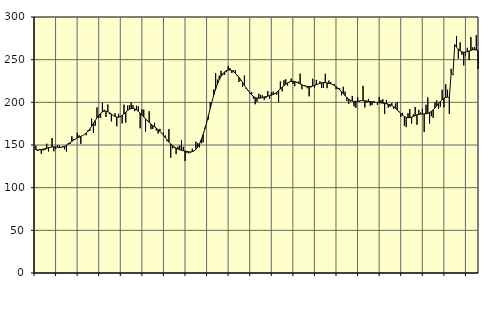
| Category | Piggar | Series 1 |
|---|---|---|
| nan | 149.1 | 144.2 |
| 1.0 | 143.1 | 144.2 |
| 1.0 | 145.3 | 144.4 |
| 1.0 | 139.7 | 144.72 |
| 1.0 | 143.7 | 145.1 |
| 1.0 | 144.1 | 145.56 |
| 1.0 | 151.5 | 146.1 |
| 1.0 | 142.4 | 146.74 |
| 1.0 | 147 | 147.3 |
| 1.0 | 158.2 | 147.66 |
| 1.0 | 142.6 | 147.77 |
| 1.0 | 145.2 | 147.68 |
| nan | 149.8 | 147.46 |
| 2.0 | 149.3 | 147.24 |
| 2.0 | 147 | 147.25 |
| 2.0 | 148.5 | 147.62 |
| 2.0 | 144.9 | 148.42 |
| 2.0 | 142.3 | 149.6 |
| 2.0 | 152.1 | 151.05 |
| 2.0 | 151.3 | 152.65 |
| 2.0 | 160.4 | 154.23 |
| 2.0 | 157.1 | 155.7 |
| 2.0 | 156.8 | 157.04 |
| 2.0 | 164.3 | 158.21 |
| nan | 161.3 | 159.2 |
| 3.0 | 151.4 | 160.14 |
| 3.0 | 161.2 | 161.12 |
| 3.0 | 162.5 | 162.33 |
| 3.0 | 161.4 | 163.97 |
| 3.0 | 167.3 | 166.14 |
| 3.0 | 166.6 | 168.78 |
| 3.0 | 180.9 | 171.86 |
| 3.0 | 164.3 | 175.22 |
| 3.0 | 172.4 | 178.63 |
| 3.0 | 194.1 | 181.92 |
| 3.0 | 181.7 | 184.84 |
| nan | 182 | 187.16 |
| 4.0 | 199.6 | 188.81 |
| 4.0 | 191.2 | 189.66 |
| 4.0 | 182.8 | 189.71 |
| 4.0 | 197.4 | 189.04 |
| 4.0 | 186 | 187.8 |
| 4.0 | 177.7 | 186.24 |
| 4.0 | 184.7 | 184.66 |
| 4.0 | 187.1 | 183.38 |
| 4.0 | 171.9 | 182.69 |
| 4.0 | 186.6 | 182.64 |
| 4.0 | 182.8 | 183.33 |
| nan | 175.4 | 184.71 |
| 5.0 | 197.3 | 186.5 |
| 5.0 | 176.3 | 188.46 |
| 5.0 | 196.1 | 190.36 |
| 5.0 | 196.6 | 191.83 |
| 5.0 | 199.8 | 192.67 |
| 5.0 | 196.7 | 192.83 |
| 5.0 | 189.7 | 192.31 |
| 5.0 | 196 | 191.13 |
| 5.0 | 195.3 | 189.45 |
| 5.0 | 169.6 | 187.43 |
| 5.0 | 191.7 | 185.19 |
| nan | 191.4 | 182.88 |
| 6.0 | 165.7 | 180.61 |
| 6.0 | 179.1 | 178.46 |
| 6.0 | 189.6 | 176.44 |
| 6.0 | 168.5 | 174.57 |
| 6.0 | 168.8 | 172.86 |
| 6.0 | 176.1 | 171.27 |
| 6.0 | 167 | 169.69 |
| 6.0 | 163.4 | 168.01 |
| 6.0 | 168.9 | 166.08 |
| 6.0 | 164.3 | 163.85 |
| 6.0 | 164.4 | 161.34 |
| nan | 161.1 | 158.66 |
| 7.0 | 154.4 | 156.01 |
| 7.0 | 168.7 | 153.55 |
| 7.0 | 135.1 | 151.31 |
| 7.0 | 146.2 | 149.32 |
| 7.0 | 146.3 | 147.69 |
| 7.0 | 139.2 | 146.37 |
| 7.0 | 148 | 145.29 |
| 7.0 | 149.6 | 144.45 |
| 7.0 | 155.5 | 143.79 |
| 7.0 | 147.9 | 143.27 |
| 7.0 | 131.3 | 142.8 |
| nan | 140.8 | 142.36 |
| 8.0 | 140 | 142.01 |
| 8.0 | 140.7 | 141.87 |
| 8.0 | 145.7 | 142.13 |
| 8.0 | 143.3 | 143.07 |
| 8.0 | 153.9 | 144.85 |
| 8.0 | 152.2 | 147.62 |
| 8.0 | 147.1 | 151.45 |
| 8.0 | 152 | 156.29 |
| 8.0 | 153 | 162.12 |
| 8.0 | 170.4 | 168.87 |
| 8.0 | 177.2 | 176.46 |
| nan | 180 | 184.62 |
| 9.0 | 200.1 | 192.95 |
| 9.0 | 201.1 | 201.11 |
| 9.0 | 215.2 | 208.76 |
| 9.0 | 234.3 | 215.61 |
| 9.0 | 226.7 | 221.53 |
| 9.0 | 231.3 | 226.45 |
| 9.0 | 237 | 230.43 |
| 9.0 | 232.1 | 233.56 |
| 9.0 | 232.2 | 235.83 |
| 9.0 | 235.4 | 237.27 |
| 9.0 | 242.5 | 237.91 |
| nan | 240.1 | 237.85 |
| 10.0 | 234.4 | 237.13 |
| 10.0 | 237.6 | 235.79 |
| 10.0 | 237.8 | 233.98 |
| 10.0 | 230.8 | 231.78 |
| 10.0 | 223.9 | 229.23 |
| 10.0 | 225.6 | 226.34 |
| 10.0 | 218.2 | 223.2 |
| 10.0 | 231.4 | 219.97 |
| 10.0 | 215.6 | 216.82 |
| 10.0 | 213.3 | 213.85 |
| 10.0 | 210.1 | 211.18 |
| nan | 212.2 | 208.89 |
| 11.0 | 204.3 | 207.07 |
| 11.0 | 197.7 | 205.77 |
| 11.0 | 200.7 | 205 |
| 11.0 | 210 | 204.81 |
| 11.0 | 208.8 | 205.05 |
| 11.0 | 208.2 | 205.61 |
| 11.0 | 203 | 206.25 |
| 11.0 | 205 | 206.84 |
| 11.0 | 213.2 | 207.33 |
| 11.0 | 204 | 207.82 |
| 11.0 | 211.6 | 208.41 |
| nan | 212.5 | 209.21 |
| 12.0 | 210.7 | 210.33 |
| 12.0 | 209 | 211.86 |
| 12.0 | 200.3 | 213.72 |
| 12.0 | 224.5 | 215.71 |
| 12.0 | 212.9 | 217.68 |
| 12.0 | 225.9 | 219.56 |
| 12.0 | 227 | 221.26 |
| 12.0 | 219.6 | 222.69 |
| 12.0 | 224.2 | 223.78 |
| 12.0 | 227.9 | 224.45 |
| 12.0 | 221.8 | 224.62 |
| nan | 218.9 | 224.3 |
| 13.0 | 222.8 | 223.58 |
| 13.0 | 224.3 | 222.6 |
| 13.0 | 233.6 | 221.53 |
| 13.0 | 215.4 | 220.52 |
| 13.0 | 219.5 | 219.66 |
| 13.0 | 219.9 | 219 |
| 13.0 | 216.5 | 218.58 |
| 13.0 | 207.1 | 218.45 |
| 13.0 | 217.5 | 218.63 |
| 13.0 | 227.6 | 219.09 |
| 13.0 | 217 | 219.76 |
| nan | 226.3 | 220.6 |
| 14.0 | 221.5 | 221.5 |
| 14.0 | 224.6 | 222.27 |
| 14.0 | 216.8 | 222.83 |
| 14.0 | 216.9 | 223.08 |
| 14.0 | 233.6 | 223.06 |
| 14.0 | 216.6 | 222.78 |
| 14.0 | 225.5 | 222.34 |
| 14.0 | 223.7 | 221.76 |
| 14.0 | 220.7 | 220.96 |
| 14.0 | 221.5 | 219.86 |
| 14.0 | 215.5 | 218.45 |
| nan | 215.5 | 216.74 |
| 15.0 | 216.4 | 214.73 |
| 15.0 | 208.2 | 212.52 |
| 15.0 | 218.2 | 210.14 |
| 15.0 | 212.5 | 207.8 |
| 15.0 | 201.7 | 205.65 |
| 15.0 | 198.2 | 203.79 |
| 15.0 | 201 | 202.4 |
| 15.0 | 207.5 | 201.51 |
| 15.0 | 195.3 | 201.09 |
| 15.0 | 193.4 | 201.06 |
| 15.0 | 206.2 | 201.29 |
| nan | 200.3 | 201.63 |
| 16.0 | 201.9 | 201.89 |
| 16.0 | 219.3 | 201.95 |
| 16.0 | 194 | 201.84 |
| 16.0 | 199.4 | 201.55 |
| 16.0 | 204 | 201.17 |
| 16.0 | 196.1 | 200.83 |
| 16.0 | 196.8 | 200.51 |
| 16.0 | 201.5 | 200.23 |
| 16.0 | 200.1 | 200 |
| 16.0 | 196.9 | 199.8 |
| 16.0 | 206.2 | 199.6 |
| nan | 202.6 | 199.36 |
| 17.0 | 203.7 | 199.06 |
| 17.0 | 186.3 | 198.71 |
| 17.0 | 202.7 | 198.33 |
| 17.0 | 193.7 | 197.88 |
| 17.0 | 194.9 | 197.17 |
| 17.0 | 199.2 | 196.16 |
| 17.0 | 192.3 | 194.82 |
| 17.0 | 198.6 | 193.11 |
| 17.0 | 200.4 | 191.13 |
| 17.0 | 189.7 | 189.01 |
| 17.0 | 183.1 | 186.88 |
| nan | 187.7 | 184.88 |
| 18.0 | 172.4 | 183.34 |
| 18.0 | 170.9 | 182.37 |
| 18.0 | 187.3 | 181.94 |
| 18.0 | 192 | 182.03 |
| 18.0 | 175.2 | 182.61 |
| 18.0 | 185.9 | 183.55 |
| 18.0 | 194.6 | 184.55 |
| 18.0 | 173.7 | 185.39 |
| 18.0 | 191.2 | 185.93 |
| 18.0 | 187.9 | 186.21 |
| 18.0 | 192.4 | 186.3 |
| nan | 165.3 | 186.41 |
| 19.0 | 197.2 | 186.63 |
| 19.0 | 205.7 | 187.1 |
| 19.0 | 175.2 | 188 |
| 19.0 | 183.7 | 189.35 |
| 19.0 | 181.7 | 191.17 |
| 19.0 | 199.9 | 193.44 |
| 19.0 | 202.2 | 195.93 |
| 19.0 | 192.5 | 198.51 |
| 19.0 | 194.8 | 200.98 |
| 19.0 | 214.7 | 203.09 |
| 19.0 | 194.2 | 204.75 |
| nan | 221.1 | 205.81 |
| 20.0 | 214.8 | 206.08 |
| 20.0 | 186.3 | 205.44 |
| 20.0 | 239.3 | 234.05 |
| 20.0 | 232.5 | 231.92 |
| 20.0 | 265.8 | 267.52 |
| 20.0 | 277.7 | 264.77 |
| 20.0 | 251.2 | 262.23 |
| 20.0 | 270.3 | 260.28 |
| 20.0 | 255.8 | 259.08 |
| 20.0 | 243.3 | 258.64 |
| 20.0 | 254.6 | 258.8 |
| nan | 263.9 | 259.39 |
| 21.0 | 249.5 | 260.13 |
| 21.0 | 276.4 | 260.9 |
| 21.0 | 264.4 | 261.51 |
| 21.0 | 264.5 | 261.69 |
| 21.0 | 278.8 | 261.34 |
| 21.0 | 239.1 | 260.46 |